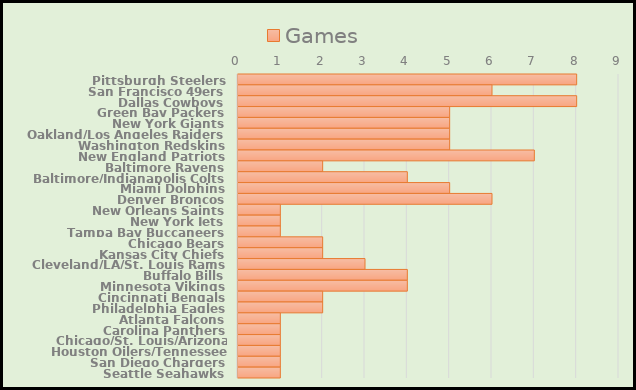
| Category | Games |
|---|---|
| Pittsburgh Steelers | 8 |
| San Francisco 49ers | 6 |
| Dallas Cowboys | 8 |
| Green Bay Packers | 5 |
| New York Giants | 5 |
| Oakland/Los Angeles Raiders | 5 |
| Washington Redskins | 5 |
| New England Patriots | 7 |
| Baltimore Ravens | 2 |
| Baltimore/Indianapolis Colts | 4 |
| Miami Dolphins | 5 |
| Denver Broncos | 6 |
| New Orleans Saints | 1 |
| New York Jets | 1 |
| Tampa Bay Buccaneers | 1 |
| Chicago Bears | 2 |
| Kansas City Chiefs | 2 |
| Cleveland/LA/St. Louis Rams | 3 |
| Buffalo Bills | 4 |
| Minnesota Vikings | 4 |
| Cincinnati Bengals | 2 |
| Philadelphia Eagles | 2 |
| Atlanta Falcons | 1 |
| Carolina Panthers | 1 |
| Chicago/St. Louis/Arizona Cardinals | 1 |
| Houston Oilers/Tennessee Titans | 1 |
| San Diego Chargers | 1 |
| Seattle Seahawks | 1 |